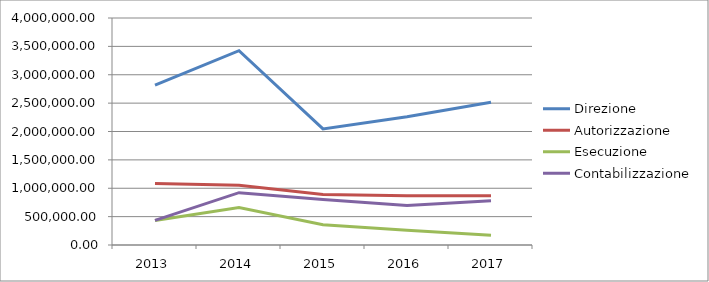
| Category | Direzione | Autorizzazione | Esecuzione | Contabilizzazione |
|---|---|---|---|---|
| 2013.0 | 2815872.174 | 1083027.759 | 433211.104 | 433211.104 |
| 2014.0 | 3424085.775 | 1053564.854 | 658478.034 | 921869.247 |
| 2015.0 | 2046157.415 | 889633.659 | 355853.463 | 800670.293 |
| 2016.0 | 2260939.399 | 869592.077 | 260877.623 | 695673.661 |
| 2017.0 | 2513647.703 | 866775.07 | 173355.014 | 780097.563 |